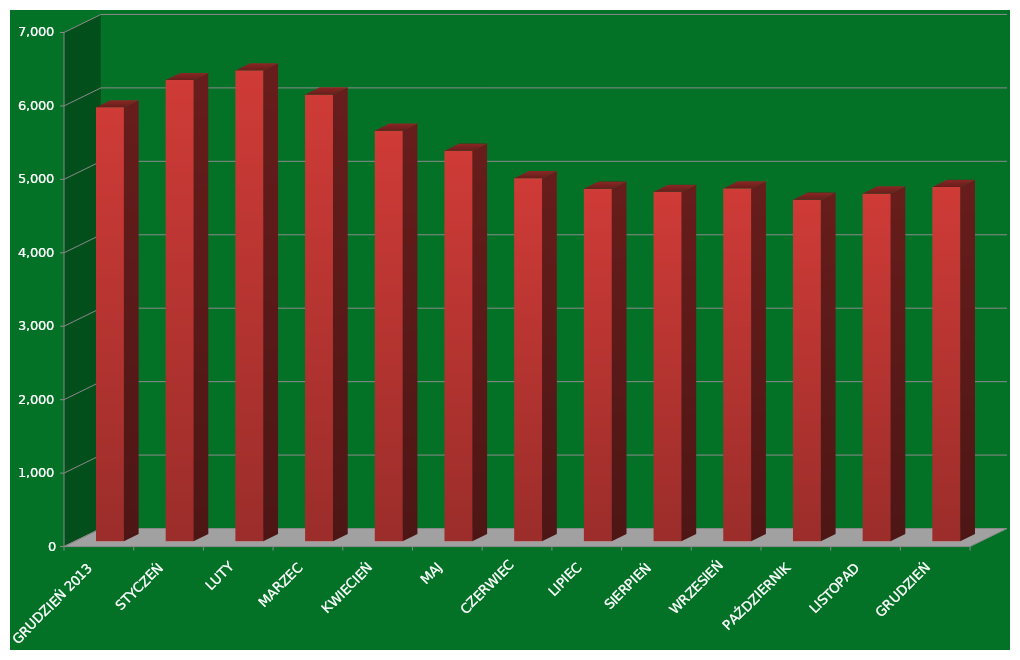
| Category | Series 0 |
|---|---|
| GRUDZIEŃ 2013 | 5907 |
| STYCZEŃ | 6278 |
| LUTY | 6410 |
| MARZEC | 6081 |
| KWIECIEŃ | 5589 |
| MAJ | 5315 |
| CZERWIEC | 4942 |
| LIPIEC | 4798 |
| SIERPIEŃ | 4756 |
| WRZESIEŃ | 4803 |
| PAŹDZIERNIK | 4648 |
| LISTOPAD | 4733 |
| GRUDZIEŃ | 4824 |